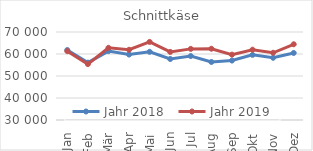
| Category | Jahr 2018 | Jahr 2019 |
|---|---|---|
| Jan | 61804.577 | 61284.062 |
| Feb | 56068.354 | 55413.084 |
| Mär | 61299.435 | 62817.573 |
| Apr | 59748.021 | 61920.575 |
| Mai | 60997.032 | 65490.711 |
| Jun | 57726.26 | 60950.908 |
| Jul | 59062.732 | 62323.96 |
| Aug | 56374.079 | 62404.529 |
| Sep | 57019.445 | 59709.01 |
| Okt | 59601.38 | 61968.869 |
| Nov | 58276.663 | 60558.343 |
| Dez | 60467.461 | 64420.732 |